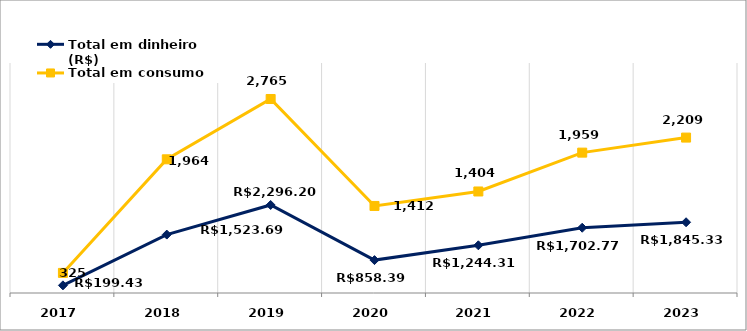
| Category | Total em dinheiro (R$) | Total em consumo (kWh) |
|---|---|---|
| 2017.0 | 199.43 | 325 |
| 2018.0 | 1523.69 | 1964 |
| 2019.0 | 2296.2 | 2765 |
| 2020.0 | 858.39 | 1412 |
| 2021.0 | 1244.31 | 1404 |
| 2022.0 | 1702.77 | 1959 |
| 2023.0 | 1845.33 | 2209 |